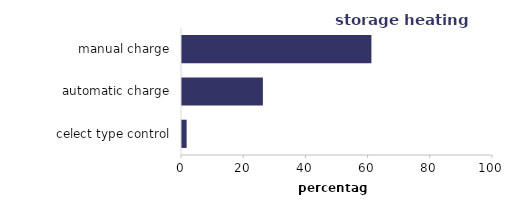
| Category | Series 0 |
|---|---|
| celect type control | 1.491 |
| automatic charge | 26.011 |
| manual charge | 60.902 |